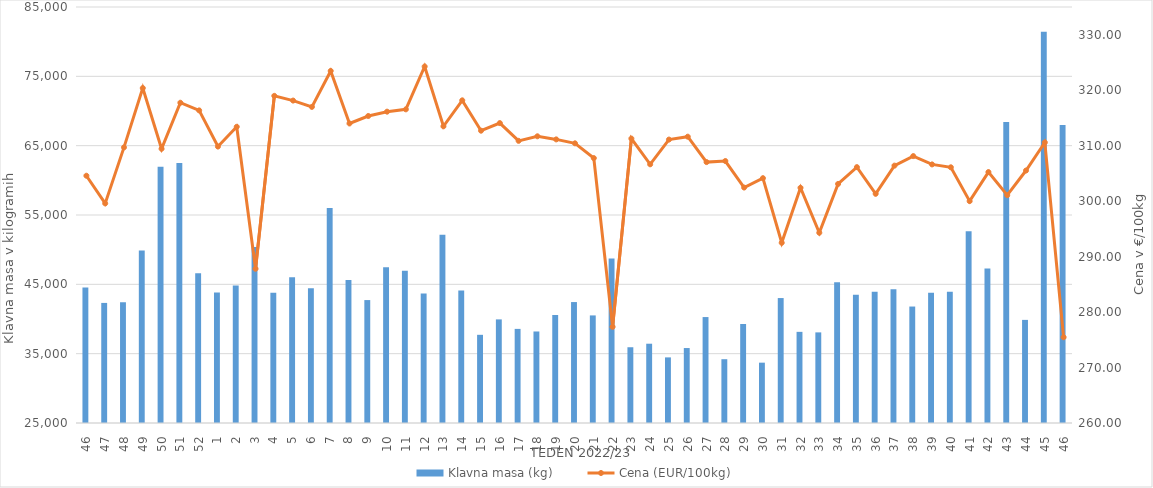
| Category | Klavna masa (kg) |
|---|---|
| 46.0 | 44528 |
| 47.0 | 42319 |
| 48.0 | 42416 |
| 49.0 | 49873 |
| 50.0 | 61942 |
| 51.0 | 62514 |
| 52.0 | 46589 |
| 1.0 | 43807 |
| 2.0 | 44834 |
| 3.0 | 50386 |
| 4.0 | 43773 |
| 5.0 | 46011 |
| 6.0 | 44439 |
| 7.0 | 56001 |
| 8.0 | 45613 |
| 9.0 | 42730 |
| 10.0 | 47471 |
| 11.0 | 46952 |
| 12.0 | 43683 |
| 13.0 | 52135 |
| 14.0 | 44103 |
| 15.0 | 37719 |
| 16.0 | 39943 |
| 17.0 | 38574 |
| 18.0 | 38200 |
| 19.0 | 40581 |
| 20.0 | 42443 |
| 21.0 | 40517 |
| 22.0 | 48742 |
| 23.0 | 35927 |
| 24.0 | 36436 |
| 25.0 | 34463 |
| 26.0 | 35812 |
| 27.0 | 40280 |
| 28.0 | 34201 |
| 29.0 | 39279 |
| 30.0 | 33702 |
| 31.0 | 43020 |
| 32.0 | 38146 |
| 33.0 | 38070 |
| 34.0 | 45290 |
| 35.0 | 43513 |
| 36.0 | 43945 |
| 37.0 | 44302 |
| 38.0 | 41798 |
| 39.0 | 43790 |
| 40.0 | 43913 |
| 41.0 | 52663 |
| 42.0 | 47275 |
| 43.0 | 68419 |
| 44.0 | 39872 |
| 45.0 | 81439 |
| 46.0 | 67983 |